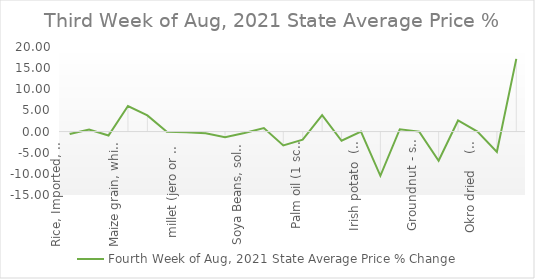
| Category | Fourth Week of Aug, 2021 |
|---|---|
| Rice, Imported, High Quality Sold loose  (1 mudu) | -0.579 |
| Rice, Agric Sold Loose(Low quality) imported  (1 mudu) | 0.493 |
| Rice Local, Sold Loose   (1 mudu) | -0.927 |
| Maize grain, white sold loose   (1 mudu) | 6.038 |
| Maize grain, yellow sold loose   (1 mudu) | 3.821 |
| Sorghum (Guinea Corn) white or brown, sold loose   (1 mudu) | -0.063 |
| millet (jero or maiwa) sold loose   (1 mudu) | -0.177 |
| Beans: white black eye. Sold loose   (1 mudu) | -0.397 |
| Beans Brown, sold loose  (1 mudu) | -1.337 |
| Soya Beans, sold loose    (1 mudu) | -0.357 |
| Gari White, sold loose  (1 mudu) | 0.826 |
| Gari Yellow, sold loose   (1 mudu) | -3.288 |
| Palm oil (1 schnap bottle) | -1.929 |
| Yam tuber (1 Medium Size) | 3.883 |
| Cassava tuber | -2.174 |
| Irish potato  (4 Litre rubber) | 0 |
| Sweet potato  (5 Medium Size) | -10.465 |
| Local live chicken  | 0.557 |
| Groundnut - shelled (fresh) | 0 |
| Tomato fresh   (4 Litre rubber) | -6.908 |
| Okro fresh     (1 mudu) | 2.632 |
| Okro dried    (1 mudu) | 0 |
| Onion   (4 Litre rubber) | -4.811 |
| Pepper fresh   (4 Litre rubber) | 17.188 |